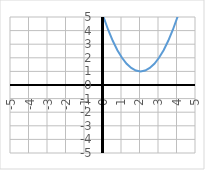
| Category | y |
|---|---|
| -5.0 | 50 |
| -4.75 | 46.562 |
| -4.5 | 43.25 |
| -4.25 | 40.062 |
| -4.0 | 37 |
| -3.75 | 34.062 |
| -3.5 | 31.25 |
| -3.25 | 28.562 |
| -3.0 | 26 |
| -2.75 | 23.562 |
| -2.5 | 21.25 |
| -2.25 | 19.062 |
| -2.0 | 17 |
| -1.75 | 15.062 |
| -1.5 | 13.25 |
| -1.25 | 11.562 |
| -1.0 | 10 |
| -0.75 | 8.562 |
| -0.5 | 7.25 |
| -0.25 | 6.062 |
| 0.0 | 5 |
| 0.25 | 4.062 |
| 0.5 | 3.25 |
| 0.75 | 2.562 |
| 1.0 | 2 |
| 1.25 | 1.562 |
| 1.5 | 1.25 |
| 1.75 | 1.062 |
| 2.0 | 1 |
| 2.25 | 1.062 |
| 2.5 | 1.25 |
| 2.75 | 1.562 |
| 3.0 | 2 |
| 3.25 | 2.562 |
| 3.5 | 3.25 |
| 3.75 | 4.062 |
| 4.0 | 5 |
| 4.25 | 6.062 |
| 4.5 | 7.25 |
| 4.75 | 8.562 |
| 5.0 | 10 |